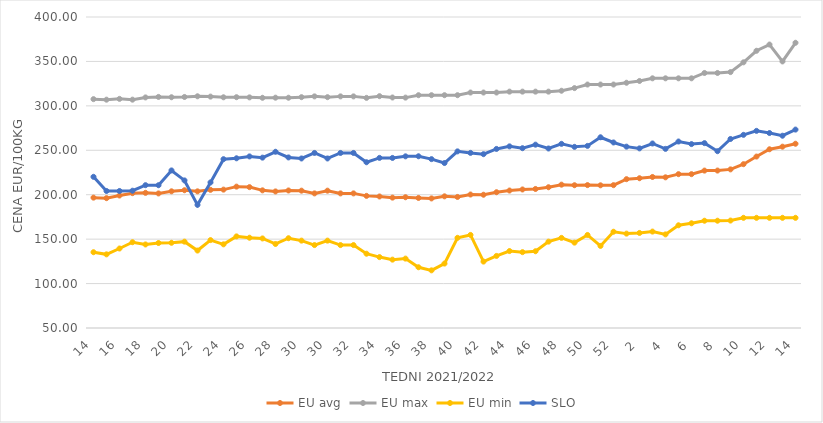
| Category | EU avg | EU max | EU min | SLO |
|---|---|---|---|---|
| 14.0 | 196.702 | 307.56 | 135.297 | 220.15 |
| 15.0 | 196.13 | 306.96 | 132.893 | 204.2 |
| 16.0 | 199.1 | 307.87 | 139.462 | 204.2 |
| 17.0 | 201.754 | 306.98 | 146.538 | 204.51 |
| 18.0 | 202.13 | 309.49 | 144.017 | 210.72 |
| 19.0 | 201.439 | 310.06 | 145.644 | 210.68 |
| 20.0 | 203.834 | 309.69 | 145.911 | 227.32 |
| 21.0 | 205.04 | 309.99 | 147.188 | 216.08 |
| 22.0 | 203.79 | 310.76 | 137.177 | 188.6 |
| 23.0 | 205.51 | 310.41 | 148.928 | 213.84 |
| 24.0 | 205.73 | 309.64 | 144.161 | 239.99 |
| 25.0 | 209.095 | 309.74 | 153.081 | 240.99 |
| 26.0 | 208.551 | 309.55 | 151.599 | 243.11 |
| 27.0 | 204.914 | 309.08 | 150.789 | 241.72 |
| 28.0 | 203.681 | 309.21 | 144.56 | 248.33 |
| 29.0 | 204.773 | 309.15 | 151.052 | 241.96 |
| 30.0 | 204.558 | 309.78 | 148.33 | 240.79 |
| 31.0 | 201.483 | 310.67 | 143.33 | 247 |
| 30.0 | 204.558 | 309.78 | 148.33 | 240.79 |
| 31.0 | 201.483 | 310.67 | 143.33 | 247 |
| 32.0 | 201.483 | 310.67 | 143.33 | 247 |
| 33.0 | 198.691 | 309 | 133.607 | 236.54 |
| 34.0 | 198.027 | 310.9 | 129.797 | 241.45 |
| 35.0 | 196.72 | 309.41 | 126.926 | 241.39 |
| 36.0 | 197.157 | 309.28 | 128.099 | 243.19 |
| 37.0 | 196.375 | 312 | 118.364 | 243.28 |
| 38.0 | 195.821 | 312 | 114.892 | 240.06 |
| 39.0 | 198.179 | 312 | 122.517 | 235.66 |
| 40.0 | 197.482 | 312 | 151.488 | 248.77 |
| 41.0 | 200.22 | 315 | 154.74 | 247.07 |
| 42.0 | 199.965 | 315 | 124.748 | 245.64 |
| 43.0 | 202.804 | 315 | 131.104 | 251.53 |
| 44.0 | 204.713 | 316 | 136.6 | 254.42 |
| 45.0 | 205.906 | 316 | 135.362 | 252.35 |
| 46.0 | 206.476 | 316 | 136.39 | 256.33 |
| 47.0 | 208.415 | 316 | 147.192 | 252.01 |
| 48.0 | 211.314 | 317 | 151.41 | 257.25 |
| 49.0 | 210.677 | 320 | 146.064 | 253.87 |
| 50.0 | 210.823 | 324 | 154.698 | 254.94 |
| 51.0 | 210.59 | 324 | 142.382 | 264.65 |
| 52.0 | 210.763 | 324 | 158.333 | 258.8 |
| 1.0 | 217.49 | 326 | 156.222 | 254.09 |
| 2.0 | 218.55 | 328 | 156.969 | 252.15 |
| 3.0 | 219.967 | 331 | 158.511 | 257.65 |
| 4.0 | 219.57 | 331 | 155.346 | 251.6 |
| 5.0 | 223.136 | 331 | 165.59 | 259.87 |
| 6.0 | 223.143 | 331 | 167.86 | 256.97 |
| 7.0 | 227.138 | 337 | 170.719 | 258.07 |
| 8.0 | 227.191 | 337 | 170.743 | 248.97 |
| 9.0 | 228.512 | 338 | 170.92 | 262.72 |
| 10.0 | 234.369 | 349 | 174 | 267.38 |
| 11.0 | 242.946 | 362 | 174 | 271.86 |
| 12.0 | 251.132 | 369 | 174 | 269.43 |
| 13.0 | 254.061 | 350 | 174 | 266.39 |
| 14.0 | 257.367 | 371 | 174 | 273.3 |